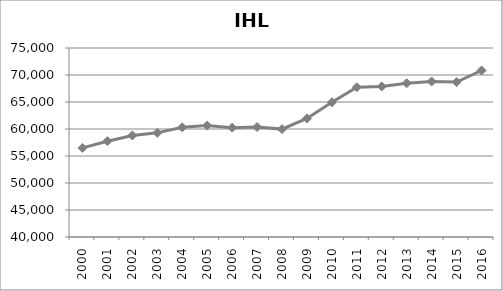
| Category | Series 0 |
|---|---|
| 2000.0 | 56497.583 |
| 2001.0 | 57737.85 |
| 2002.0 | 58803.067 |
| 2003.0 | 59285.492 |
| 2004.0 | 60315 |
| 2005.0 | 60645 |
| 2006.0 | 60249 |
| 2007.0 | 60362.575 |
| 2008.0 | 59980.292 |
| 2009.0 | 61955.629 |
| 2010.0 | 64948.304 |
| 2011.0 | 67735.275 |
| 2012.0 | 67881.925 |
| 2013.0 | 68469.292 |
| 2014.0 | 68799.554 |
| 2015.0 | 68685.312 |
| 2016.0 | 70834.367 |